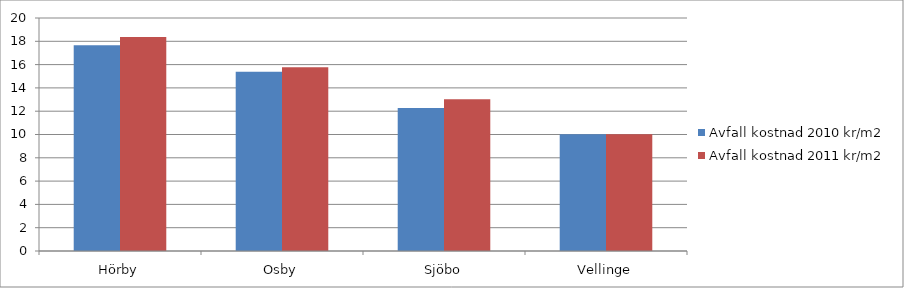
| Category | Avfall kostnad 2010 kr/m2 | Avfall kostnad 2011 kr/m2 |
|---|---|---|
| Hörby | 17.67 | 18.37 |
| Osby | 15.38 | 15.78 |
| Sjöbo | 12.28 | 13.02 |
| Vellinge | 10.03 | 10.03 |